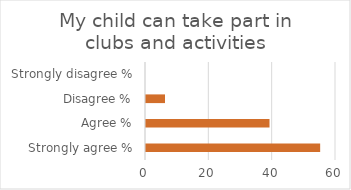
| Category | Series 1 |
|---|---|
| Strongly agree % | 55 |
| Agree % | 39 |
| Disagree % | 6 |
| Strongly disagree % | 0 |